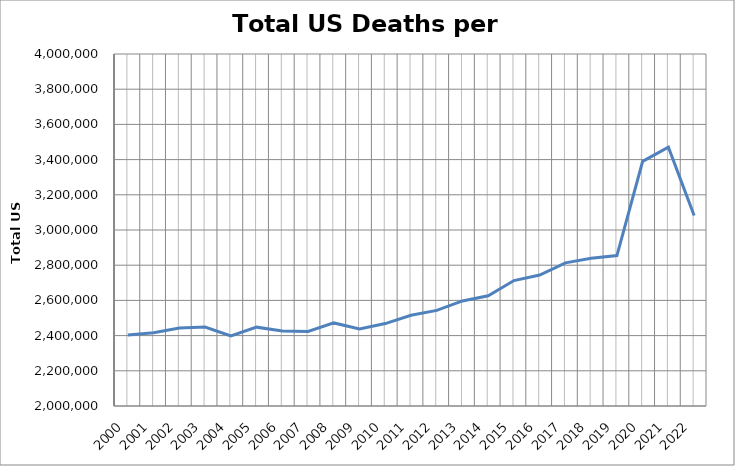
| Category | Total Deaths |
|---|---|
| 2000.0 | 2403351 |
| 2001.0 | 2416425 |
| 2002.0 | 2443387 |
| 2003.0 | 2448288 |
| 2004.0 | 2397615 |
| 2005.0 | 2448017 |
| 2006.0 | 2426264 |
| 2007.0 | 2423712 |
| 2008.0 | 2471984 |
| 2009.0 | 2437163 |
| 2010.0 | 2468435 |
| 2011.0 | 2515458 |
| 2012.0 | 2543279 |
| 2013.0 | 2596993 |
| 2014.0 | 2626418 |
| 2015.0 | 2712630 |
| 2016.0 | 2744248 |
| 2017.0 | 2813503 |
| 2018.0 | 2839205 |
| 2019.0 | 2854838 |
| 2020.0 | 3390079 |
| 2021.0 | 3470402 |
| 2022.0 | 3082274 |